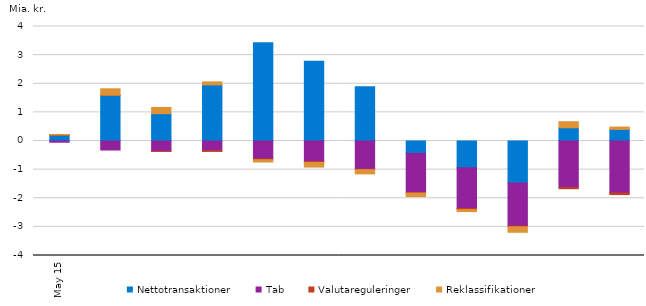
| Category | Nettotransaktioner | Tab | Valutareguleringer | Reklassifikationer |
|---|---|---|---|---|
| 2015-05-01 | 197922547.673 | -42996862 | 13539829.51 | 16106350.17 |
| 2015-06-01 | 1595238838.236 | -314845450.86 | 4514724.27 | 224148583.17 |
| 2015-07-01 | 955784008.919 | -358078639.94 | -1342403.04 | 216913764.66 |
| 2015-08-01 | 1960715964.902 | -338982470.94 | -24651132.33 | 104787297.29 |
| 2015-09-01 | 3432264778.205 | -622242005.32 | -33817041.26 | -78274764.05 |
| 2015-10-01 | 2782142711.447 | -720315892.32 | -28801984.29 | -162433222.73 |
| 2015-11-01 | 1894032385.89 | -986133382.99 | -16295197.88 | -146649203.12 |
| 2015-12-01 | -430644410.007 | -1372663626.8 | -16084114.45 | -121864125.09 |
| 2016-01-01 | -934390957.789 | -1423598697.6 | -39274006.55 | -68505927.96 |
| 2016-02-01 | -1465786777.744 | -1507925548.6 | -23521755.26 | -191088840.44 |
| 2016-03-01 | 462502531.347 | -1619140631.8 | -46428294.19 | 210642918.68 |
| 2016-04-01 | 404859862.451 | -1816160417.18 | -55158977.95 | 82918147.29 |